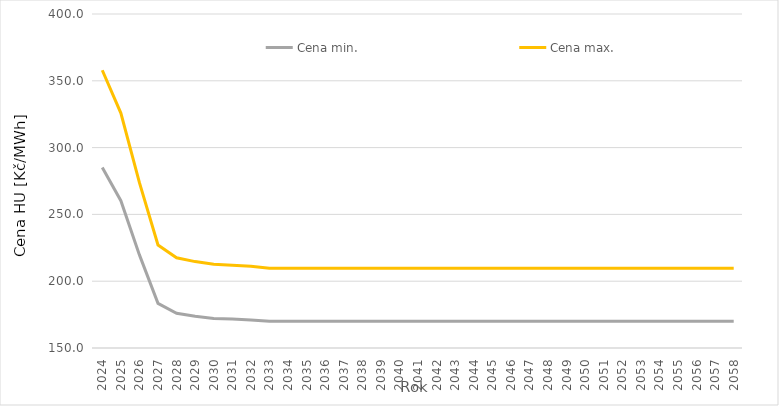
| Category | Cena min. | Cena max. |
|---|---|---|
| 2024.0 | 285.162 | 357.894 |
| 2025.0 | 260.226 | 325.833 |
| 2026.0 | 219.709 | 273.74 |
| 2027.0 | 183.434 | 227.101 |
| 2028.0 | 176.016 | 217.563 |
| 2029.0 | 173.764 | 214.668 |
| 2030.0 | 172.164 | 212.61 |
| 2031.0 | 171.634 | 211.929 |
| 2032.0 | 171.038 | 211.163 |
| 2033.0 | 169.962 | 209.78 |
| 2034.0 | 169.962 | 209.78 |
| 2035.0 | 169.962 | 209.78 |
| 2036.0 | 169.962 | 209.78 |
| 2037.0 | 169.962 | 209.78 |
| 2038.0 | 169.962 | 209.78 |
| 2039.0 | 169.962 | 209.78 |
| 2040.0 | 169.962 | 209.78 |
| 2041.0 | 169.962 | 209.78 |
| 2042.0 | 169.962 | 209.78 |
| 2043.0 | 169.962 | 209.78 |
| 2044.0 | 169.962 | 209.78 |
| 2045.0 | 169.962 | 209.78 |
| 2046.0 | 169.962 | 209.78 |
| 2047.0 | 169.962 | 209.78 |
| 2048.0 | 169.962 | 209.78 |
| 2049.0 | 169.962 | 209.78 |
| 2050.0 | 169.962 | 209.78 |
| 2051.0 | 169.962 | 209.78 |
| 2052.0 | 169.962 | 209.78 |
| 2053.0 | 169.962 | 209.78 |
| 2054.0 | 169.962 | 209.78 |
| 2055.0 | 169.962 | 209.78 |
| 2056.0 | 169.962 | 209.78 |
| 2057.0 | 169.962 | 209.78 |
| 2058.0 | 169.962 | 209.78 |